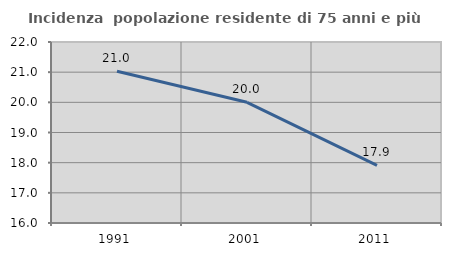
| Category | Incidenza  popolazione residente di 75 anni e più |
|---|---|
| 1991.0 | 21.032 |
| 2001.0 | 20 |
| 2011.0 | 17.91 |